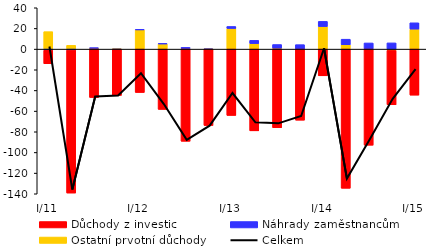
| Category | Ostatní prvotní důchody | Náhrady zaměstnancům | Důchody z investic |
|---|---|---|---|
| I/11 | 16.905 | -1.179 | -13.01 |
| II | 3.673 | -0.898 | -138.45 |
| III | 0.917 | 0.182 | -46.828 |
| IV | 0.201 | -0.359 | -44.5 |
| I/12 | 18.684 | 0.227 | -41.994 |
| II | 5.046 | 0.336 | -58.363 |
| III | 0.625 | 1.034 | -89.224 |
| IV | 0.042 | -0.116 | -73.825 |
| I/13 | 19.989 | 1.936 | -64.207 |
| II | 5.367 | 3.108 | -79.099 |
| III | 0.9 | 3.539 | -76.077 |
| IV | -0.021 | 4.321 | -68.775 |
| I/14 | 21.825 | 5.021 | -25.838 |
| II | 4.194 | 5.405 | -134.69 |
| III | 0.166 | 5.79 | -92.96 |
| IV | -1.284 | 6.025 | -52.617 |
| I/15 | 19.364 | 6.09 | -44.559 |